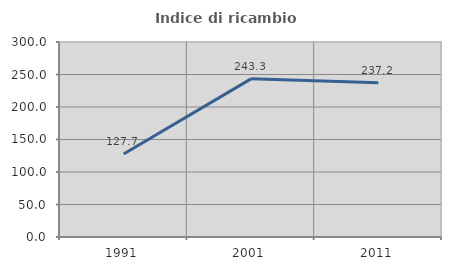
| Category | Indice di ricambio occupazionale  |
|---|---|
| 1991.0 | 127.703 |
| 2001.0 | 243.333 |
| 2011.0 | 237.179 |